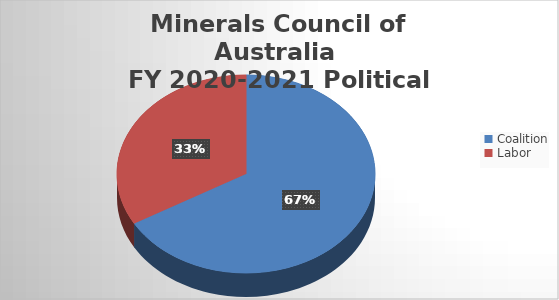
| Category | Series 0 |
|---|---|
| Coalition | 129283 |
| Labor | 64660 |